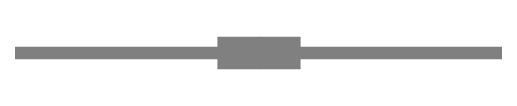
| Category | Ліва частина голови | Права частина голови |
|---|---|---|
| 0 | -6.75 | 6.75 |